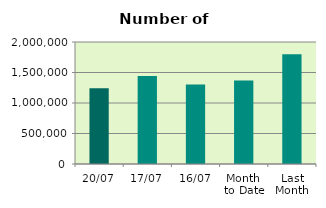
| Category | Series 0 |
|---|---|
| 20/07 | 1242382 |
| 17/07 | 1443330 |
| 16/07 | 1304546 |
| Month 
to Date | 1370611 |
| Last
Month | 1799892.818 |